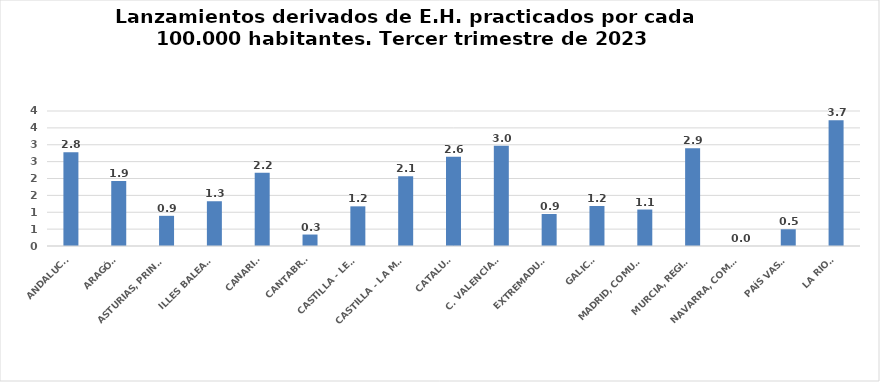
| Category | Series 0 |
|---|---|
| ANDALUCÍA | 2.779 |
| ARAGÓN | 1.927 |
| ASTURIAS, PRINCIPADO | 0.894 |
| ILLES BALEARS | 1.326 |
| CANARIAS | 2.169 |
| CANTABRIA | 0.34 |
| CASTILLA - LEÓN | 1.175 |
| CASTILLA - LA MANCHA | 2.067 |
| CATALUÑA | 2.646 |
| C. VALENCIANA | 2.97 |
| EXTREMADURA | 0.948 |
| GALICIA | 1.185 |
| MADRID, COMUNIDAD | 1.08 |
| MURCIA, REGIÓN | 2.898 |
| NAVARRA, COM. FORAL | 0 |
| PAÍS VASCO | 0.496 |
| LA RIOJA | 3.724 |